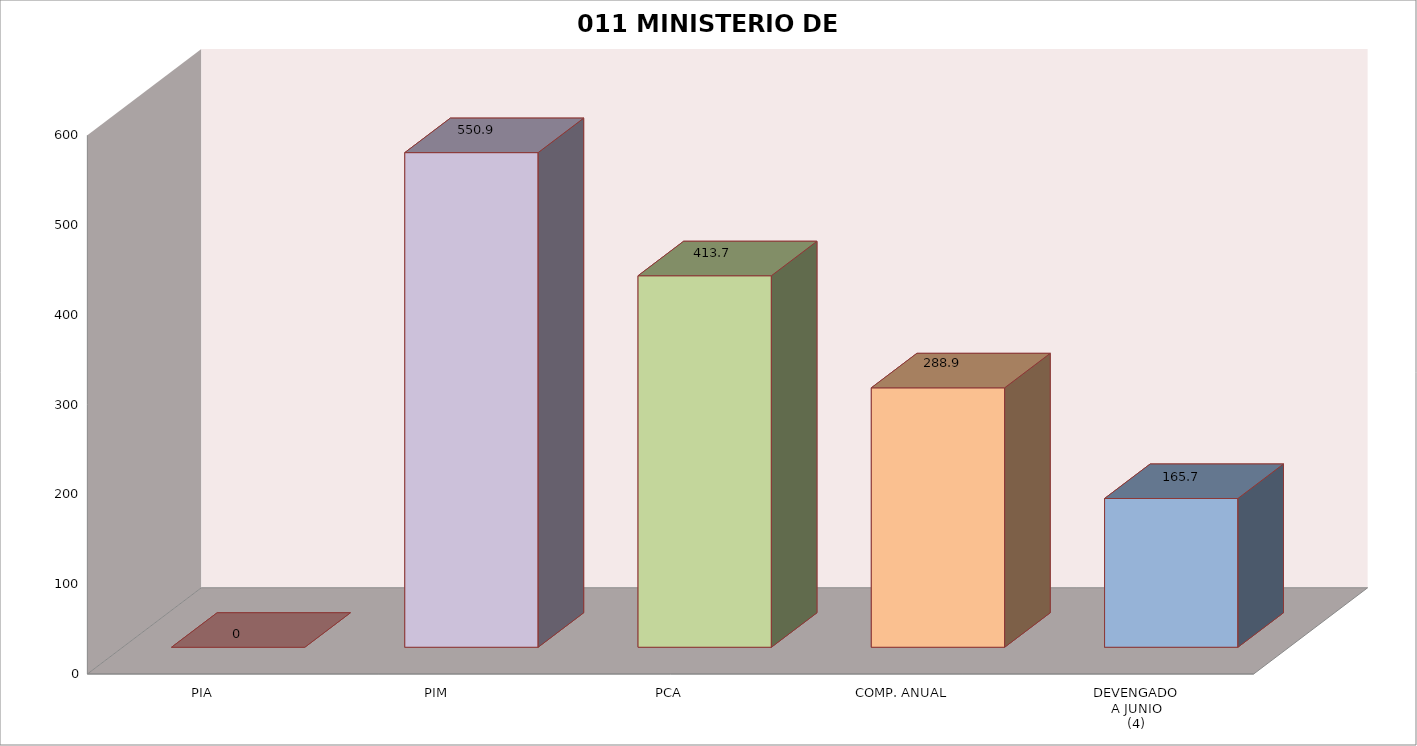
| Category | 011 MINISTERIO DE SALUD |
|---|---|
| PIA | 0 |
| PIM | 550.858 |
| PCA | 413.748 |
| COMP. ANUAL | 288.92 |
| DEVENGADO
A JUNIO
(4) | 165.676 |